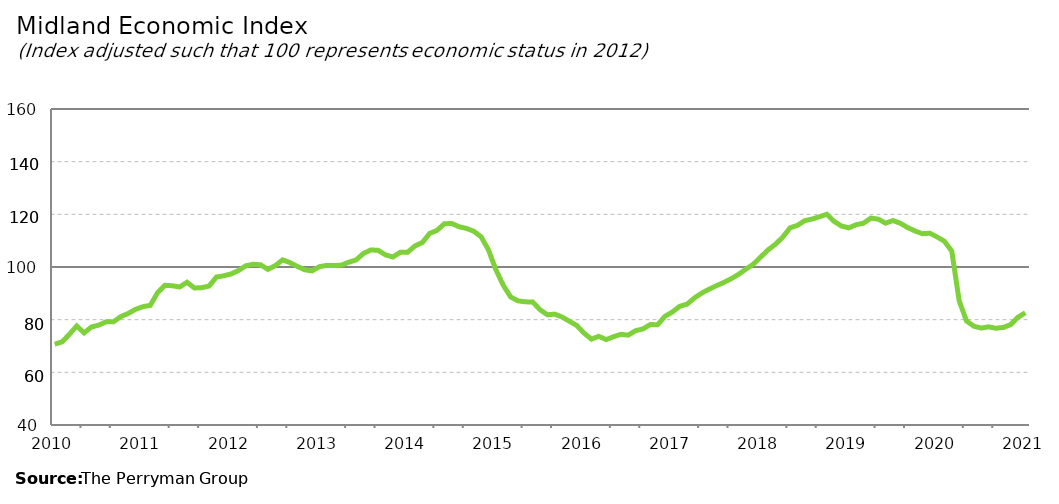
| Category | Midland Composite |
|---|---|
| 2010-01-31 | 70.701 |
| 2010-02-28 | 71.554 |
| 2010-03-31 | 74.459 |
| 2010-04-30 | 77.593 |
| 2010-05-31 | 74.991 |
| 2010-06-30 | 77.218 |
| 2010-07-31 | 77.934 |
| 2010-08-31 | 79.192 |
| 2010-09-30 | 79.21 |
| 2010-10-31 | 81.176 |
| 2010-11-30 | 82.352 |
| 2010-12-31 | 83.931 |
| 2011-01-31 | 84.936 |
| 2011-02-28 | 85.429 |
| 2011-03-31 | 90.282 |
| 2011-04-30 | 93.048 |
| 2011-05-31 | 92.878 |
| 2011-06-30 | 92.41 |
| 2011-07-31 | 94.209 |
| 2011-08-31 | 92.032 |
| 2011-09-30 | 92.148 |
| 2011-10-31 | 92.767 |
| 2011-11-30 | 96.21 |
| 2011-12-31 | 96.66 |
| 2012-01-31 | 97.374 |
| 2012-02-29 | 98.66 |
| 2012-03-31 | 100.478 |
| 2012-04-30 | 101.031 |
| 2012-05-31 | 100.845 |
| 2012-06-30 | 99.08 |
| 2012-07-31 | 100.531 |
| 2012-08-31 | 102.706 |
| 2012-09-30 | 101.654 |
| 2012-10-31 | 100.217 |
| 2012-11-30 | 98.956 |
| 2012-12-31 | 98.521 |
| 2013-01-31 | 100.114 |
| 2013-02-28 | 100.625 |
| 2013-03-31 | 100.528 |
| 2013-04-30 | 100.721 |
| 2013-05-31 | 101.824 |
| 2013-06-30 | 102.692 |
| 2013-07-31 | 105.156 |
| 2013-08-31 | 106.49 |
| 2013-09-30 | 106.329 |
| 2013-10-31 | 104.571 |
| 2013-11-30 | 103.802 |
| 2013-12-31 | 105.6 |
| 2014-01-31 | 105.616 |
| 2014-02-28 | 108.018 |
| 2014-03-31 | 109.293 |
| 2014-04-30 | 112.769 |
| 2014-05-31 | 113.923 |
| 2014-06-30 | 116.431 |
| 2014-07-31 | 116.513 |
| 2014-08-31 | 115.287 |
| 2014-09-30 | 114.644 |
| 2014-10-31 | 113.574 |
| 2014-11-30 | 111.451 |
| 2014-12-31 | 106.434 |
| 2015-01-31 | 98.962 |
| 2015-02-28 | 93.092 |
| 2015-03-31 | 88.632 |
| 2015-04-30 | 87.161 |
| 2015-05-31 | 86.763 |
| 2015-06-30 | 86.736 |
| 2015-07-31 | 83.784 |
| 2015-08-31 | 81.864 |
| 2015-09-30 | 82.104 |
| 2015-10-31 | 81.016 |
| 2015-11-30 | 79.394 |
| 2015-12-31 | 77.788 |
| 2016-01-31 | 74.857 |
| 2016-02-29 | 72.596 |
| 2016-03-31 | 73.679 |
| 2016-04-30 | 72.431 |
| 2016-05-31 | 73.534 |
| 2016-06-30 | 74.433 |
| 2016-07-31 | 74.138 |
| 2016-08-31 | 75.814 |
| 2016-09-30 | 76.484 |
| 2016-10-31 | 78.149 |
| 2016-11-30 | 78.08 |
| 2016-12-31 | 81.294 |
| 2017-01-31 | 82.913 |
| 2017-02-28 | 85.066 |
| 2017-03-31 | 85.894 |
| 2017-04-30 | 88.25 |
| 2017-05-31 | 90.103 |
| 2017-06-30 | 91.574 |
| 2017-07-31 | 92.913 |
| 2017-08-31 | 94.125 |
| 2017-09-30 | 95.56 |
| 2017-10-31 | 97.198 |
| 2017-11-30 | 99.194 |
| 2017-12-31 | 101.045 |
| 2018-01-31 | 103.759 |
| 2018-02-28 | 106.465 |
| 2018-03-31 | 108.62 |
| 2018-04-30 | 111.3 |
| 2018-05-31 | 114.873 |
| 2018-06-30 | 115.798 |
| 2018-07-31 | 117.599 |
| 2018-08-31 | 118.208 |
| 2018-09-30 | 119.062 |
| 2018-10-31 | 120.022 |
| 2018-11-30 | 117.32 |
| 2018-12-31 | 115.553 |
| 2019-01-31 | 114.866 |
| 2019-02-28 | 116.06 |
| 2019-03-31 | 116.633 |
| 2019-04-30 | 118.584 |
| 2019-05-31 | 118.168 |
| 2019-06-30 | 116.66 |
| 2019-07-31 | 117.63 |
| 2019-08-31 | 116.612 |
| 2019-09-30 | 114.975 |
| 2019-10-31 | 113.679 |
| 2019-11-30 | 112.635 |
| 2019-12-31 | 112.829 |
| 2020-01-31 | 111.419 |
| 2020-02-29 | 109.756 |
| 2020-03-31 | 106.007 |
| 2020-04-30 | 87.22 |
| 2020-05-31 | 79.505 |
| 2020-06-30 | 77.516 |
| 2020-07-31 | 76.792 |
| 2020-08-31 | 77.285 |
| 2020-09-30 | 76.736 |
| 2020-10-31 | 77.042 |
| 2020-11-30 | 78.112 |
| 2020-12-31 | 80.926 |
| 2021-01-31 | 82.635 |